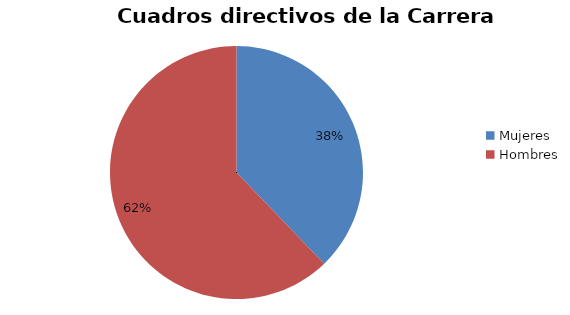
| Category | Series 0 |
|---|---|
| Mujeres | 45 |
| Hombres | 74 |